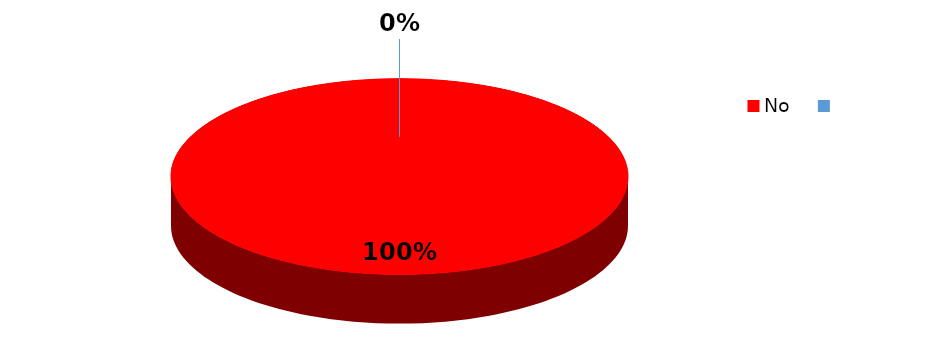
| Category | Frecuencia |
|---|---|
| No | 7 |